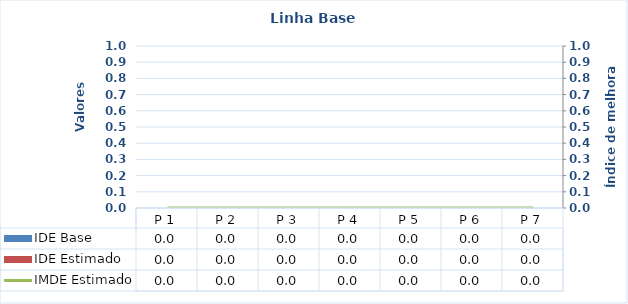
| Category | IDE Base | IDE Estimado |
|---|---|---|
| P 1 | 0 | 0 |
| P 2 | 0 | 0 |
| P 3 | 0 | 0 |
| P 4 | 0 | 0 |
| P 5 | 0 | 0 |
| P 6 | 0 | 0 |
| P 7 | 0 | 0 |